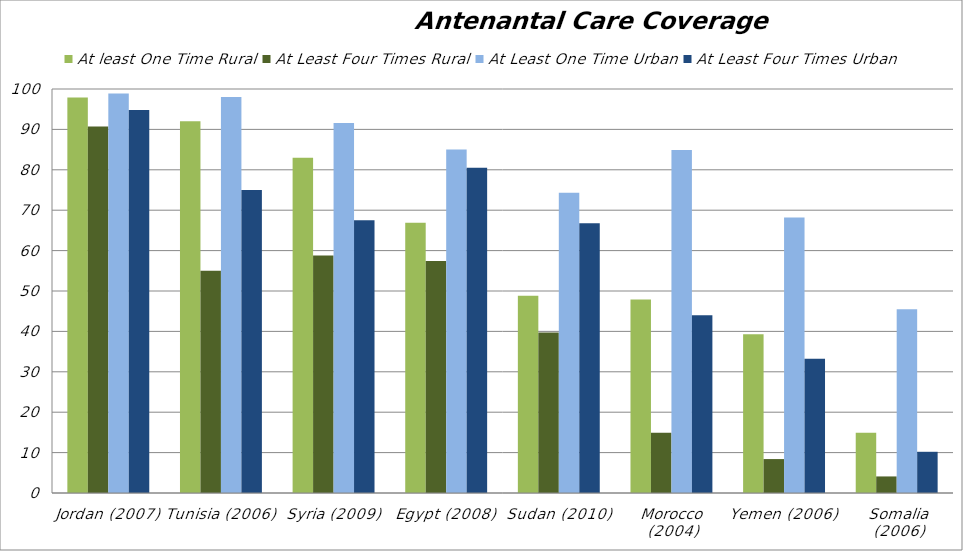
| Category | At least One Time Rural | At Least Four Times Rural | At Least One Time Urban | At Least Four Times Urban |
|---|---|---|---|---|
| Jordan (2007) | 97.9 | 90.7 | 98.9 | 94.8 |
| Tunisia (2006) | 92 | 55 | 98 | 75 |
| Syria (2009) | 83 | 58.8 | 91.6 | 67.5 |
| Egypt (2008) | 66.9 | 57.4 | 85 | 80.5 |
| Sudan (2010) | 48.8 | 39.7 | 74.3 | 66.8 |
| Morocco (2004) | 47.9 | 14.9 | 84.9 | 44 |
| Yemen (2006) | 39.3 | 8.4 | 68.2 | 33.2 |
| Somalia (2006) | 14.9 | 4.1 | 45.5 | 10.2 |